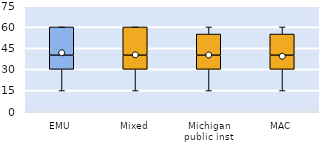
| Category | 25th | 50th | 75th |
|---|---|---|---|
| EMU | 30 | 10 | 20 |
| Mixed | 30 | 10 | 20 |
| Michigan public inst | 30 | 10 | 15 |
| MAC | 30 | 10 | 15 |